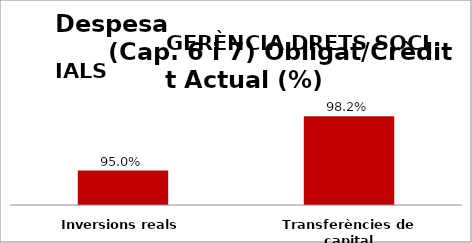
| Category | Series 0 |
|---|---|
| Inversions reals | 0.95 |
| Transferències de capital | 0.982 |